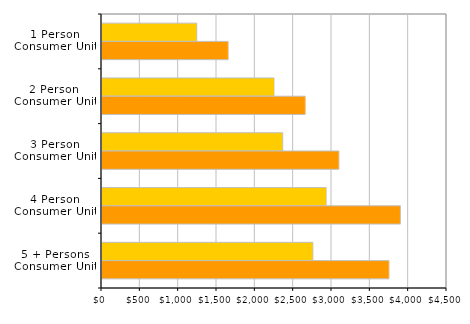
| Category | 2000 | 2010 |
|---|---|---|
| 1 Person
Consumer Unit | 1236 | 1645 |
| 2 Person 
Consumer Unit | 2243 | 2650 |
| 3 Person
Consumer Unit | 2357 | 3090 |
| 4 Person
Consumer Unit | 2923 | 3892 |
| 5 + Persons
Consumer Unit | 2750 | 3743 |